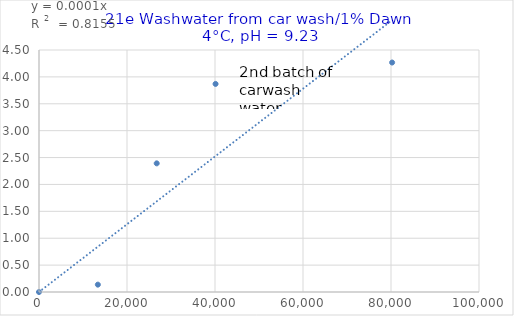
| Category | Series 0 |
|---|---|
| 0.0 | 0 |
| 13375.79617834395 | 0.137 |
| 26751.5923566879 | 2.392 |
| 40127.388535031845 | 3.869 |
| 80254.77707006369 | 4.267 |